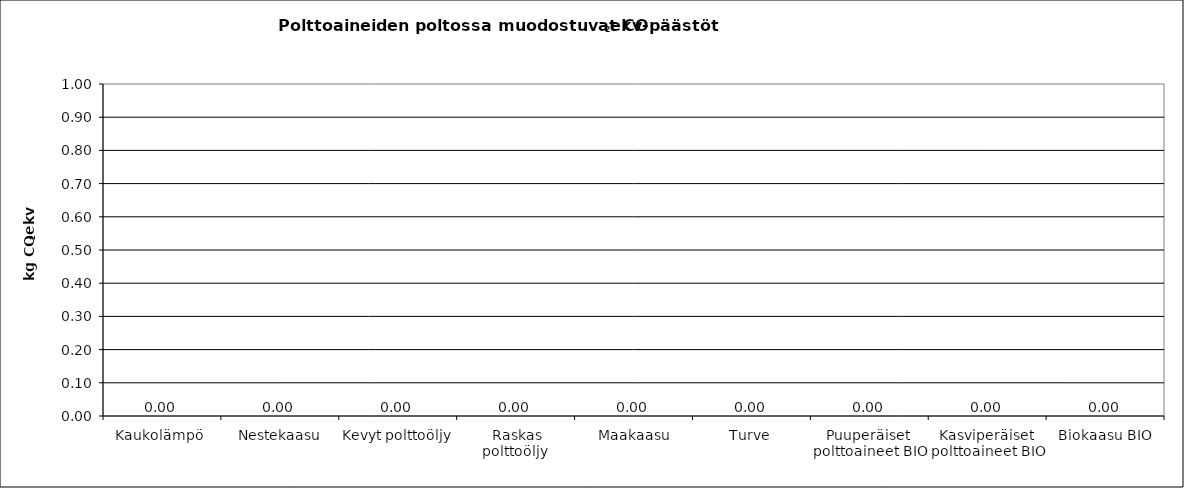
| Category | Series 0 |
|---|---|
| Kaukolämpö  | 0 |
| Nestekaasu | 0 |
| Kevyt polttoöljy | 0 |
| Raskas polttoöljy  | 0 |
| Maakaasu | 0 |
| Turve | 0 |
| Puuperäiset 
polttoaineet BIO | 0 |
| Kasviperäiset 
polttoaineet BIO | 0 |
| Biokaasu BIO | 0 |